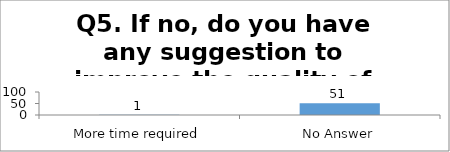
| Category | Q5. If no, do you have any suggestion to improve the quality of such session in future?  |
|---|---|
| More time required | 1 |
| No Answer | 51 |